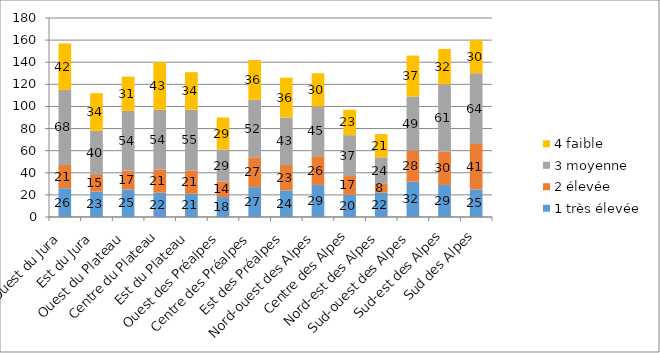
| Category | 1 très élevée | 2 élevée | 3 moyenne | 4 faible |
|---|---|---|---|---|
| Ouest du Jura | 26 | 21 | 68 | 42 |
| Est du Jura | 23 | 15 | 40 | 34 |
| Ouest du Plateau | 25 | 17 | 54 | 31 |
| Centre du Plateau | 22 | 21 | 54 | 43 |
| Est du Plateau | 21 | 21 | 55 | 34 |
| Ouest des Préalpes | 18 | 14 | 29 | 29 |
| Centre des Préalpes | 27 | 27 | 52 | 36 |
| Est des Préalpes | 24 | 23 | 43 | 36 |
| Nord-ouest des Alpes | 29 | 26 | 45 | 30 |
| Centre des Alpes | 20 | 17 | 37 | 23 |
| Nord-est des Alpes | 22 | 8 | 24 | 21 |
| Sud-ouest des Alpes | 32 | 28 | 49 | 37 |
| Sud-est des Alpes | 29 | 30 | 61 | 32 |
| Sud des Alpes | 25 | 41 | 64 | 30 |